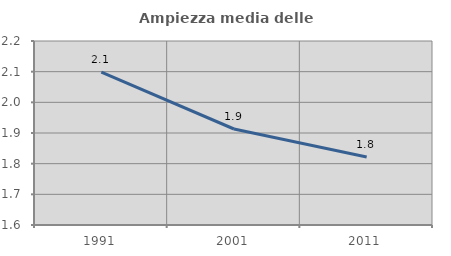
| Category | Ampiezza media delle famiglie |
|---|---|
| 1991.0 | 2.099 |
| 2001.0 | 1.913 |
| 2011.0 | 1.822 |